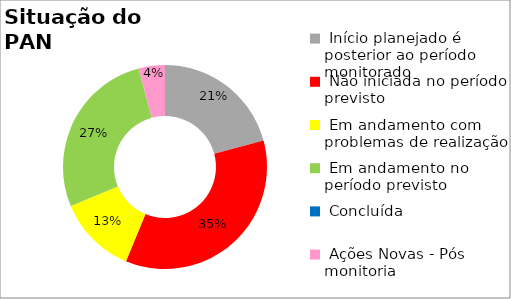
| Category | Series 0 |
|---|---|
|  Início planejado é posterior ao período monitorado | 0.208 |
|  Não iniciada no período previsto | 0.354 |
|  Em andamento com problemas de realização | 0.125 |
|  Em andamento no período previsto  | 0.271 |
|  Concluída | 0 |
|  Ações Novas - Pós monitoria | 0.042 |